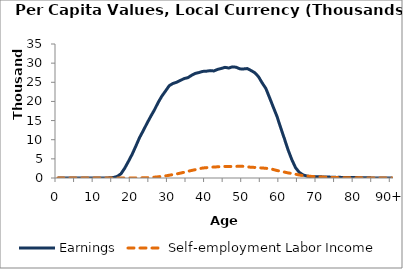
| Category | Earnings | Self-employment Labor Income |
|---|---|---|
| 0 | 0 | 0 |
|  | 0.321 | 0 |
| 2 | 0 | 0 |
| 3 | 0 | 0 |
| 4 | 0.331 | 0 |
| 5 | 0 | 0 |
| 6 | 0.337 | 0.021 |
| 7 | 0.335 | 0 |
| 8 | 0.517 | 0 |
| 9 | 0.413 | 0.071 |
| 10 | 0.551 | 0 |
| 11 | 1.48 | 0.157 |
| 12 | 3.205 | 0.233 |
| 13 | 12.074 | 0.348 |
| 14 | 44.057 | 0.518 |
| 15 | 143.119 | 0.771 |
| 16 | 412.109 | 1.071 |
| 17 | 1111.658 | 1.975 |
| 18 | 2557.789 | 3.528 |
| 19 | 4335.102 | 6.722 |
| 20 | 6191.453 | 10.628 |
| 21 | 8341.283 | 19.907 |
| 22 | 10564.189 | 31.535 |
| 23 | 12377.664 | 52.103 |
| 24 | 14285.711 | 80.775 |
| 25 | 16081.978 | 136.091 |
| 26 | 17784.029 | 221.664 |
| 27 | 19718.33 | 306.398 |
| 28 | 21383.539 | 435.873 |
| 29 | 22736.49 | 550.221 |
| 30 | 24126.736 | 721.208 |
| 31 | 24696.332 | 896.162 |
| 32 | 25009.426 | 1053.65 |
| 33 | 25492.764 | 1275.347 |
| 34 | 25970.67 | 1499.95 |
| 35 | 26205.014 | 1748.977 |
| 36 | 26818.678 | 1969.416 |
| 37 | 27312.154 | 2165.392 |
| 38 | 27550.191 | 2406.602 |
| 39 | 27841.475 | 2612.274 |
| 40 | 27895.748 | 2697.717 |
| 41 | 28046.779 | 2813.694 |
| 42 | 27959.521 | 2868.297 |
| 43 | 28364.008 | 2920.711 |
| 44 | 28608.658 | 2947.246 |
| 45 | 28904.945 | 3015.429 |
| 46 | 28725.184 | 3022.95 |
| 47 | 29028.285 | 2986.718 |
| 48 | 28931.391 | 3035.592 |
| 49 | 28506.766 | 3066.312 |
| 50 | 28485.439 | 3033.674 |
| 51 | 28584.135 | 2932.238 |
| 52 | 28075.391 | 2794.612 |
| 53 | 27505.375 | 2768.383 |
| 54 | 26486.889 | 2646.919 |
| 55 | 24852.916 | 2630.227 |
| 56 | 23376.365 | 2522.381 |
| 57 | 20971.654 | 2459.905 |
| 58 | 18512.107 | 2216.023 |
| 59 | 16076.213 | 1951.254 |
| 60 | 13122.656 | 1772.191 |
| 61 | 10249.014 | 1542.2 |
| 62 | 7296.391 | 1330.847 |
| 63 | 4780.708 | 1181.899 |
| 64 | 2685.355 | 986.598 |
| 65 | 1471.444 | 779.191 |
| 66 | 818.093 | 635.672 |
| 67 | 518.011 | 524.241 |
| 68 | 358.693 | 442.499 |
| 69 | 318.426 | 356.65 |
| 70 | 306.719 | 307.823 |
| 71 | 295.515 | 277.218 |
| 72 | 281.158 | 199.828 |
| 73 | 242.576 | 171.973 |
| 74 | 190.589 | 144.577 |
| 75 | 159.352 | 120.588 |
| 76 | 167.957 | 106.003 |
| 77 | 127.265 | 90.716 |
| 78 | 130.937 | 86.967 |
| 79 | 127.19 | 66.101 |
| 80 | 126.178 | 53.869 |
| 81 | 82.055 | 43.901 |
| 82 | 67.69 | 35.777 |
| 83 | 46.525 | 29.157 |
| 84 | 35.558 | 23.761 |
| 85 | 25.001 | 19.364 |
| 86 | 0 | 0 |
| 87 | 0 | 0 |
| 88 | 0 | 0 |
| 89 | 0 | 0 |
| 90+ | 0 | 0 |